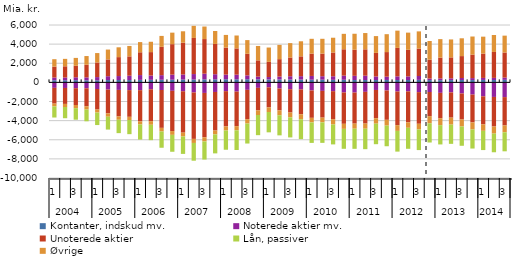
| Category | Kontanter, indskud mv. | Noterede aktier mv. | Unoterede aktier | Noterede aktier m.m. | Øvrige passiver | Lån, passiver | Øvrige |
|---|---|---|---|---|---|---|---|
| 0 | 222.058 | -574.202 | 1139.494 | 282.214 | -293.844 | -1160.018 | 779.353 |
| 1 | 223.886 | -584.65 | 1174.118 | 282.961 | -321.558 | -1175.063 | 778.27 |
| 2 | 231.673 | -611.099 | 1206.449 | 297.125 | -332.486 | -1206.334 | 824.193 |
| 3 | 216.531 | -620.176 | 1320.452 | 303.26 | -348.108 | -1225.094 | 912.916 |
| 4 | 216.593 | -692.305 | 1527.007 | 335.815 | -318.481 | -1304.857 | 985.594 |
| 5 | 244.304 | -753.398 | 1753.657 | 400.391 | -350.369 | -1342.656 | 1032.864 |
| 6 | 245.927 | -788.881 | 1978.922 | 416.349 | -347.236 | -1396.981 | 1026.268 |
| 7 | 244.059 | -810.307 | 2019.727 | 453.704 | -330.347 | -1482.199 | 1091.383 |
| 8 | 260.095 | -815.831 | 2384.064 | 504.064 | -326.95 | -1578.993 | 1063.752 |
| 9 | 266.599 | -724.653 | 2451.465 | 447.154 | -380.165 | -1608.636 | 1082.636 |
| 10 | 273.294 | -796.144 | 2959.746 | 481.35 | -380.885 | -1697.647 | 1145.246 |
| 11 | 279.187 | -884.435 | 3190.7 | 527.111 | -396.764 | -1766.767 | 1203.792 |
| 12 | 295.48 | -930.523 | 3324.932 | 528.901 | -400.704 | -1821.313 | 1192.547 |
| 13 | 296.378 | -1054.012 | 3774.895 | 573.95 | -425.165 | -1856.476 | 1269.606 |
| 14 | 317.45 | -1104.033 | 3622.744 | 590.288 | -434.303 | -1896.331 | 1310.744 |
| 15 | 319.574 | -1003.093 | 3168.556 | 530.326 | -405.633 | -1984.21 | 1355.258 |
| 16 | 327.224 | -919.871 | 2827.724 | 482.975 | -428.773 | -2007.928 | 1325.134 |
| 17 | 325.393 | -964.556 | 2748.98 | 478.989 | -436.277 | -2059.242 | 1348.396 |
| 18 | 331.053 | -781.69 | 2257.54 | 400.252 | -452.4 | -2090.382 | 1431.816 |
| 19 | 323.666 | -573.391 | 1698.72 | 279.194 | -481.34 | -2110.185 | 1506.512 |
| 20 | 310.305 | -519.883 | 1585.598 | 247.322 | -480.695 | -2128.837 | 1501.554 |
| 21 | 303.607 | -641.023 | 1822.001 | 302.946 | -502.861 | -2102.051 | 1490.667 |
| 22 | 298.31 | -716.717 | 1959.953 | 342.889 | -507.077 | -2096.107 | 1503.049 |
| 23 | 292.962 | -739.193 | 2072.311 | 356.565 | -519.41 | -2082.92 | 1574.634 |
| 24 | 278.502 | -844.147 | 2334.554 | 394.684 | -480.979 | -2139.827 | 1549.222 |
| 25 | 282.226 | -889.469 | 2364.536 | 361.913 | -494.873 | -2143.434 | 1549.784 |
| 26 | 266.328 | -921.522 | 2486.794 | 370.752 | -553.315 | -2079.708 | 1545.285 |
| 27 | 272.55 | -1051.429 | 2755.655 | 433.594 | -527.925 | -2083.521 | 1614.216 |
| 28 | 251.094 | -1063.85 | 2725.275 | 434.313 | -529.89 | -2105.004 | 1673.821 |
| 29 | 247.76 | -990.577 | 2756.619 | 451.344 | -537.908 | -2138.634 | 1702.756 |
| 30 | 248.9 | -793.939 | 2466.471 | 368.627 | -572.171 | -2147.233 | 1755.804 |
| 31 | 252.187 | -847.32 | 2573.628 | 342.874 | -605.947 | -2156.68 | 1871.514 |
| 32 | 246.622 | -954.493 | 2974.981 | 384.008 | -599.338 | -2166.981 | 1804.794 |
| 33 | 248.607 | -943.027 | 2780.182 | 377.421 | -567.725 | -2194.515 | 1796.077 |
| 34 | 260.844 | -1020.659 | 2868.405 | 405.711 | -596.026 | -2154.712 | 1798.521 |
| 35 | 239.73 | -1006.649 | 1973.89 | 164.632 | -750.926 | -2007.185 | 1949.375 |
| 36 | 232.837 | -1095.928 | 2177.016 | 180.766 | -727.666 | -2015.361 | 1932.492 |
| 37 | 243.108 | -1049.83 | 2190.658 | 180.774 | -732.354 | -2007.693 | 1875.54 |
| 38 | 248.167 | -1158.092 | 2290.46 | 210.891 | -734.863 | -2012.58 | 1859.983 |
| 39 | 243.787 | -1277.472 | 2451.717 | 205.436 | -738.848 | -1991.41 | 1896.22 |
| 40 | 254.823 | -1458.349 | 2542.323 | 212.066 | -672.47 | -2010.972 | 1771.625 |
| 41 | 250.124 | -1524.327 | 2711.991 | 219.107 | -744.888 | -1950.587 | 1776.146 |
| 42 | 264.305 | -1540.699 | 2624.087 | 234.882 | -710.887 | -1990.797 | 1764.471 |